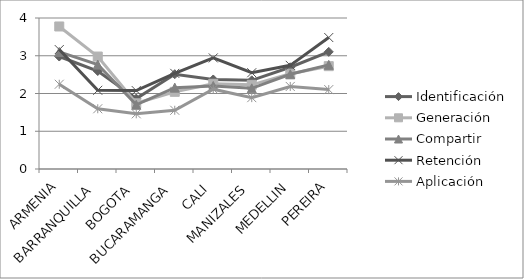
| Category | Identificación | Generación  | Compartir | Retención | Aplicación |
|---|---|---|---|---|---|
| ARMENIA | 2.98 | 3.776 | 3.102 | 3.163 | 2.245 |
| BARRANQUILLA | 2.596 | 2.979 | 2.766 | 2.085 | 1.596 |
| BOGOTA | 1.865 | 1.74 | 1.702 | 2.077 | 1.462 |
| BUCARAMANGA | 2.511 | 2.044 | 2.156 | 2.533 | 1.556 |
| CALI | 2.371 | 2.257 | 2.2 | 2.943 | 2.114 |
| MANIZALES | 2.349 | 2.229 | 2.138 | 2.55 | 1.89 |
| MEDELLIN | 2.695 | 2.525 | 2.508 | 2.746 | 2.186 |
| PEREIRA | 3.103 | 2.724 | 2.759 | 3.483 | 2.103 |